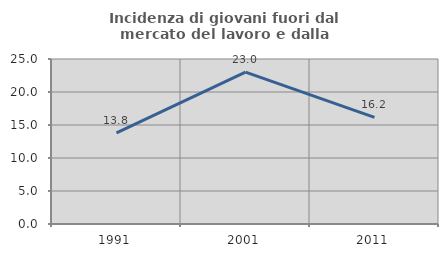
| Category | Incidenza di giovani fuori dal mercato del lavoro e dalla formazione  |
|---|---|
| 1991.0 | 13.81 |
| 2001.0 | 22.999 |
| 2011.0 | 16.164 |